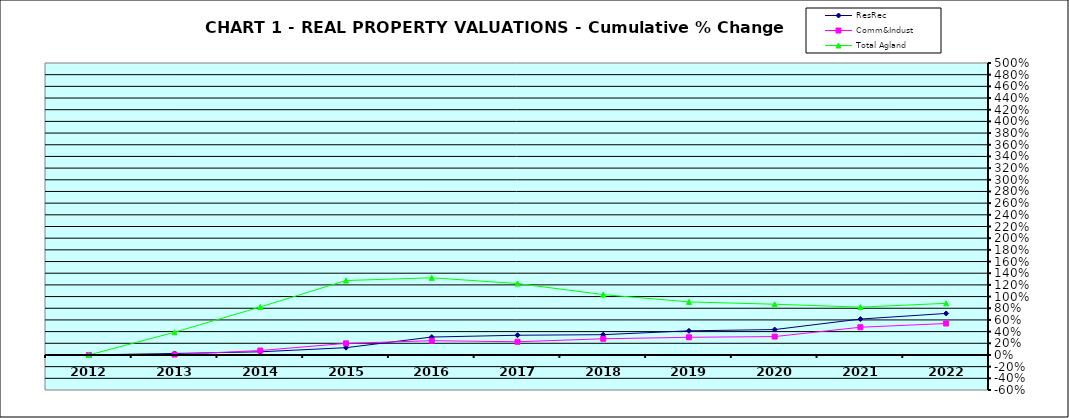
| Category | ResRec | Comm&Indust | Total Agland |
|---|---|---|---|
| 2012.0 | 0 | 0 | 0 |
| 2013.0 | 0.025 | 0.007 | 0.389 |
| 2014.0 | 0.054 | 0.076 | 0.822 |
| 2015.0 | 0.125 | 0.199 | 1.275 |
| 2016.0 | 0.307 | 0.244 | 1.321 |
| 2017.0 | 0.338 | 0.226 | 1.224 |
| 2018.0 | 0.347 | 0.277 | 1.034 |
| 2019.0 | 0.414 | 0.303 | 0.909 |
| 2020.0 | 0.435 | 0.315 | 0.869 |
| 2021.0 | 0.615 | 0.475 | 0.819 |
| 2022.0 | 0.711 | 0.539 | 0.884 |